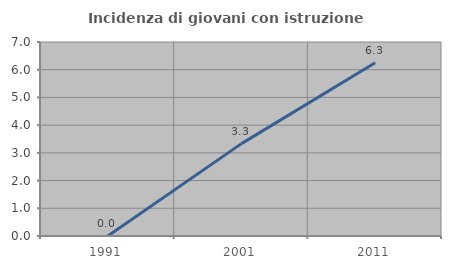
| Category | Incidenza di giovani con istruzione universitaria |
|---|---|
| 1991.0 | 0 |
| 2001.0 | 3.333 |
| 2011.0 | 6.25 |